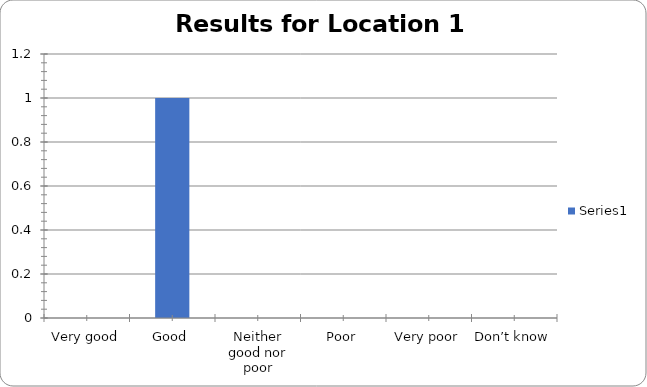
| Category | Series 0 |
|---|---|
| Very good | 0 |
| Good | 1 |
| Neither good nor poor | 0 |
| Poor | 0 |
| Very poor | 0 |
| Don’t know | 0 |